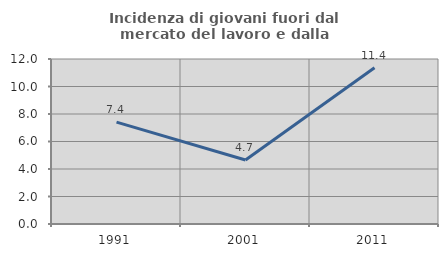
| Category | Incidenza di giovani fuori dal mercato del lavoro e dalla formazione  |
|---|---|
| 1991.0 | 7.407 |
| 2001.0 | 4.651 |
| 2011.0 | 11.364 |